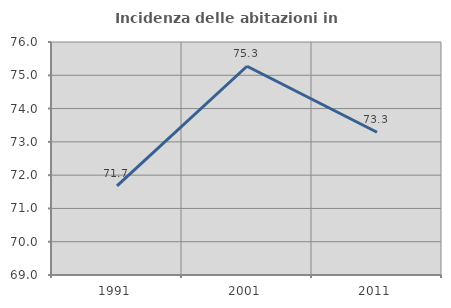
| Category | Incidenza delle abitazioni in proprietà  |
|---|---|
| 1991.0 | 71.678 |
| 2001.0 | 75.271 |
| 2011.0 | 73.288 |